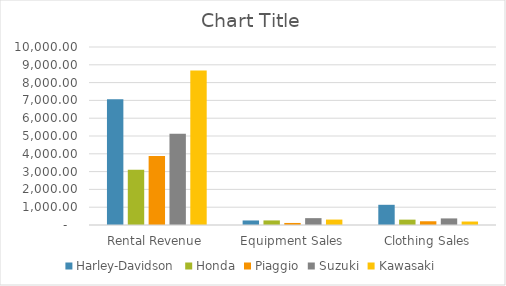
| Category | Harley-Davidson | Honda | Piaggio | Suzuki | Kawasaki |
|---|---|---|---|---|---|
| Rental Revenue | 7060 | 3100 | 3883 | 5121 | 8677 |
| Equipment Sales | 255 | 257 | 115 | 385 | 305 |
| Clothing Sales | 1135 | 301 | 210 | 370 | 195 |